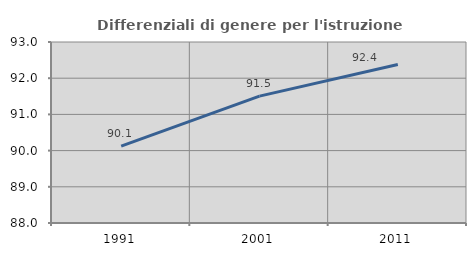
| Category | Differenziali di genere per l'istruzione superiore |
|---|---|
| 1991.0 | 90.126 |
| 2001.0 | 91.504 |
| 2011.0 | 92.378 |